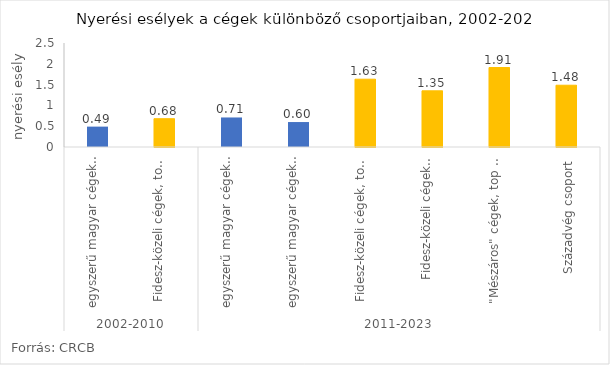
| Category | Series 0 |
|---|---|
| 0 | 0.49 |
| 1 | 0.68 |
| 2 | 0.71 |
| 3 | 0.6 |
| 4 | 1.63 |
| 5 | 1.35 |
| 6 | 1.91 |
| 7 | 1.485 |